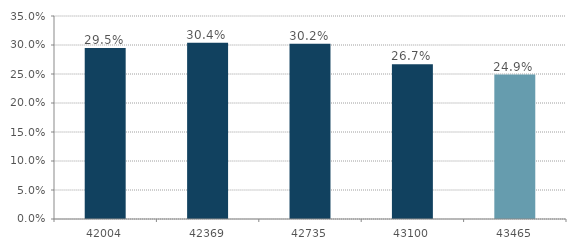
| Category | Series 0 |
|---|---|
| 12/31/14 | 0.295 |
| 12/31/15 | 0.304 |
| 12/31/16 | 0.302 |
| 12/31/17 | 0.267 |
| 12/31/18 | 0.249 |